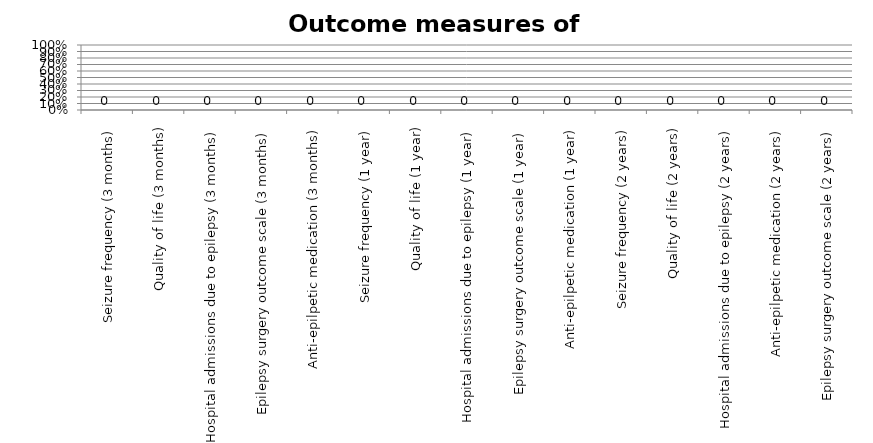
| Category | Series 0 |
|---|---|
| Seizure frequency (3 months) | 0 |
| Quality of life (3 months) | 0 |
| Hospital admissions due to epilepsy (3 months) | 0 |
| Epilepsy surgery outcome scale (3 months) | 0 |
| Anti-epilpetic medication (3 months) | 0 |
| Seizure frequency (1 year) | 0 |
| Quality of life (1 year) | 0 |
| Hospital admissions due to epilepsy (1 year) | 0 |
| Epilepsy surgery outcome scale (1 year) | 0 |
| Anti-epilpetic medication (1 year) | 0 |
| Seizure frequency (2 years) | 0 |
| Quality of life (2 years) | 0 |
| Hospital admissions due to epilepsy (2 years) | 0 |
| Anti-epilpetic medication (2 years) | 0 |
| Epilepsy surgery outcome scale (2 years) | 0 |